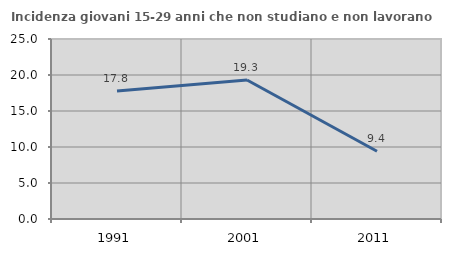
| Category | Incidenza giovani 15-29 anni che non studiano e non lavorano  |
|---|---|
| 1991.0 | 17.778 |
| 2001.0 | 19.298 |
| 2011.0 | 9.412 |